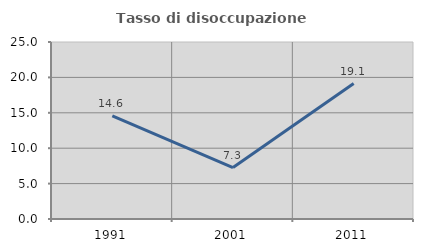
| Category | Tasso di disoccupazione giovanile  |
|---|---|
| 1991.0 | 14.566 |
| 2001.0 | 7.265 |
| 2011.0 | 19.126 |